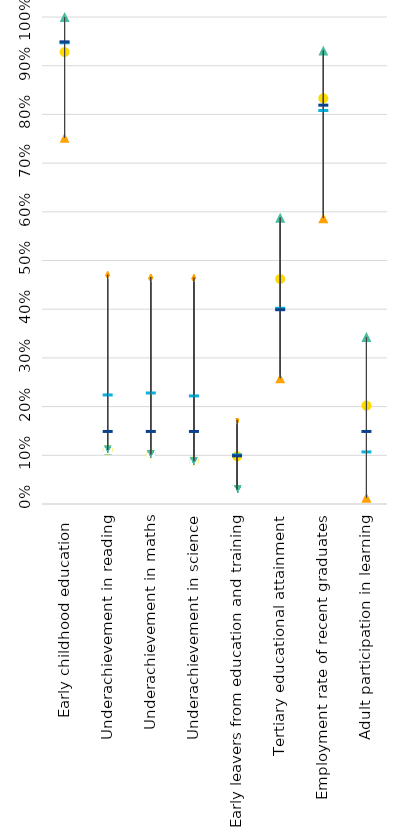
| Category | Estonia | Strongest performer | Weakest performer | EU average | EU target |
|---|---|---|---|---|---|
| Early childhood education  | 0.928 | 1 | 0.752 | 0.948 | 0.95 |
| Underachievement in reading | 0.111 | 0.111 | 0.471 | 0.225 | 0.15 |
| Underachievement in maths | 0.102 | 0.102 | 0.466 | 0.229 | 0.15 |
| Underachievement in science | 0.088 | 0.088 | 0.465 | 0.223 | 0.15 |
| Early leavers from education and training | 0.098 | 0.03 | 0.173 | 0.102 | 0.1 |
| Tertiary educational attainment | 0.462 | 0.588 | 0.258 | 0.403 | 0.4 |
| Employment rate of recent graduates | 0.833 | 0.931 | 0.587 | 0.809 | 0.82 |
| Adult participation in learning | 0.202 | 0.343 | 0.013 | 0.108 | 0.15 |